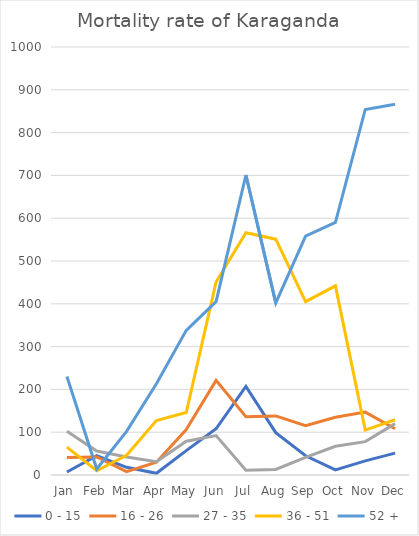
| Category | 0 - 15 | 16 - 26 | 27 - 35 | 36 - 51 | 52 + |
|---|---|---|---|---|---|
| Jan | 7 | 41 | 102 | 65 | 230 |
| Feb | 45 | 42 | 56 | 10 | 14 |
| Mar | 18 | 8 | 42 | 46 | 102 |
| Apr | 4 | 30 | 31 | 127 | 213 |
| May | 57 | 106 | 79 | 146 | 338 |
| Jun | 108 | 221 | 92 | 451 | 405 |
| Jul | 207 | 136 | 11 | 566 | 701 |
| Aug | 99 | 138 | 13 | 551 | 402 |
| Sep | 45 | 115 | 41 | 405 | 558 |
| Oct | 12 | 135 | 67 | 442 | 590 |
| Nov | 33 | 147 | 78 | 105 | 854 |
| Dec | 51 | 108 | 120 | 129 | 866 |